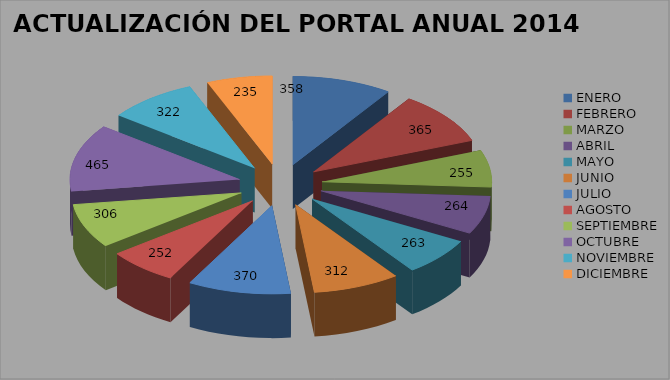
| Category | ACTUALIZACIÓN DEL PORTAL ANUAL 2014 |
|---|---|
| ENERO | 358 |
| FEBRERO | 365 |
| MARZO | 255 |
| ABRIL | 264 |
| MAYO | 263 |
| JUNIO | 312 |
| JULIO | 370 |
| AGOSTO | 252 |
| SEPTIEMBRE | 306 |
| OCTUBRE | 465 |
| NOVIEMBRE | 322 |
| DICIEMBRE | 235 |